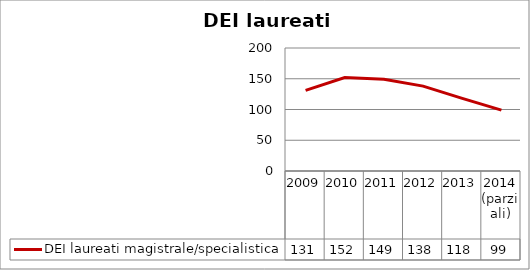
| Category | DEI laureati magistrale/specialistica |
|---|---|
| 2009 | 131 |
| 2010 | 152 |
| 2011 | 149 |
| 2012 | 138 |
| 2013 | 118 |
| 2014
(parziali) | 99 |